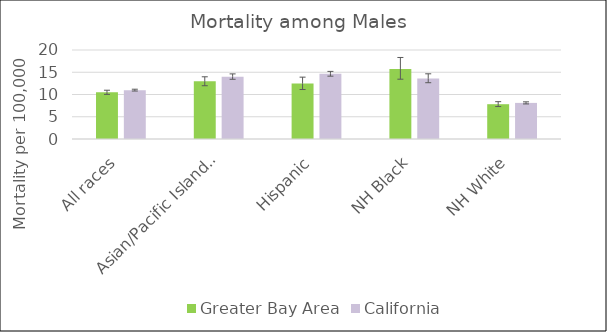
| Category | Greater Bay Area | California | US Mortality |
|---|---|---|---|
| All races | 10.49 | 10.98 |  |
| Asian/Pacific Islander | 12.95 | 14.01 |  |
| Hispanic | 12.46 | 14.65 |  |
| NH Black | 15.74 | 13.62 |  |
| NH White | 7.82 | 8.11 |  |